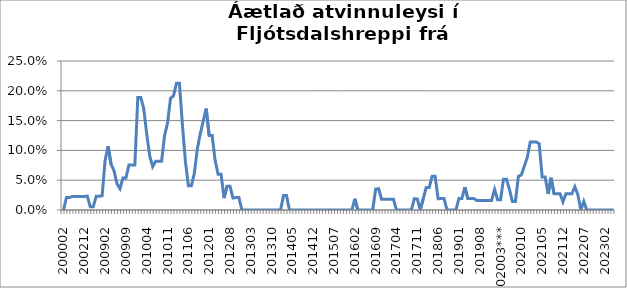
| Category | Series 0 |
|---|---|
| 200002 | 0 |
| 200102 | 0.021 |
| 200103 | 0.021 |
| 200111 | 0.023 |
| 200112 | 0.023 |
| 200201 | 0.023 |
| 200211 | 0.023 |
| 200212 | 0.023 |
| 200302 | 0.023 |
| 200409 | 0.005 |
| 200410 | 0.005 |
| 200811 | 0.023 |
| 200812 | 0.023 |
| 200901 | 0.024 |
| 200902 | 0.083 |
| 200903 | 0.107 |
| 200904 | 0.077 |
| 200905 | 0.066 |
| 200906 | 0.044 |
| 200907 | 0.036 |
| 200908 | 0.054 |
| 200909 | 0.054 |
| 200910 | 0.075 |
| 200911 | 0.075 |
| 200912 | 0.075 |
| 201001 | 0.189 |
| 201002 | 0.189 |
| 201003 | 0.17 |
| 201004 | 0.127 |
| 201005 | 0.091 |
| 201006 | 0.073 |
| 201007 | 0.082 |
| 201008 | 0.082 |
| 201009 | 0.082 |
| 201010 | 0.125 |
| 201011 | 0.146 |
| 201012 | 0.188 |
| 201101 | 0.191 |
| 201102 | 0.213 |
| 201103 | 0.213 |
| 201104 | 0.143 |
| 201105 | 0.082 |
| 201106 | 0.041 |
| 201107 | 0.041 |
| 201108 | 0.061 |
| 201109 | 0.102 |
| 201110 | 0.128 |
| 201111 | 0.149 |
| 201112 | 0.17 |
| 201201 | 0.125 |
| 201202 | 0.125 |
| 201203 | 0.083 |
| 201204 | 0.06 |
| 201205 | 0.06 |
| 201206 | 0.02 |
| 201207 | 0.04 |
| 201208 | 0.04 |
| 201209 | 0.02 |
| 201210 | 0.021 |
| 201211 | 0.021 |
| 201212 | 0 |
| 201301 | 0 |
| 201302 | 0 |
| 201303 | 0 |
| 201304 | 0 |
| 201305 | 0 |
| 201306 | 0 |
| 201307 | 0 |
| 201308 | 0 |
| 201309 | 0 |
| 201310 | 0 |
| 201311 | 0 |
| 201312 | 0 |
| 201401 | 0 |
| 201402 | 0.024 |
| 201403 | 0.024 |
| 201404 | 0 |
| 201405 | 0 |
| 201406 | 0 |
| 201407 | 0 |
| 201408 | 0 |
| 201409 | 0 |
| 201410 | 0 |
| 201411 | 0 |
| 201412 | 0 |
| 201501 | 0 |
| 201502 | 0 |
| 201503 | 0 |
| 201504 | 0 |
| 201505 | 0 |
| 201506 | 0 |
| 201507 | 0 |
| 201508 | 0 |
| 201509 | 0 |
| 201510 | 0 |
| 201511 | 0 |
| 201512 | 0 |
| 201601 | 0 |
| 201602 | 0.019 |
| 201603 | 0 |
| 201604 | 0 |
| 201605 | 0 |
| 201606 | 0 |
| 201607 | 0 |
| 201608 | 0 |
| 201609 | 0.035 |
| 201610 | 0.036 |
| 201611 | 0.018 |
| 201612 | 0.018 |
| 201701 | 0.018 |
| 201702 | 0.018 |
| 201703 | 0.018 |
| 201704 | 0 |
| 201705 | 0 |
| 201706 | 0 |
| 201707 | 0 |
| 201708 | 0 |
| 201709 | 0 |
| 201710 | 0.019 |
| 201711 | 0.019 |
| 201712 | 0 |
| 201801 | 0.019 |
| 201802 | 0.038 |
| 201803 | 0.038 |
| 201804 | 0.057 |
| 201805 | 0.057 |
| 201806 | 0.019 |
| 201807 | 0.019 |
| 201808 | 0.019 |
| 201809 | 0 |
| 201810 | 0 |
| 201811 | 0 |
| 201812 | 0 |
| 201901 | 0.019 |
| 201902 | 0.019 |
| 201903 | 0.038 |
| 201904 | 0.019 |
| 201905 | 0.019 |
| 201906 | 0.019 |
| 201907 | 0.016 |
| 201908 | 0.016 |
| 201909 | 0.016 |
| 201910 | 0.016 |
| 201911 | 0.016 |
| 201912 | 0.016 |
| 202001 | 0.034 |
| 202002 | 0.017 |
| 202003*** | 0.017 |
| 202004 | 0.052 |
| 202005 | 0.052 |
| 202006 | 0.034 |
| 202007 | 0.014 |
| 202008 | 0.014 |
| 202009 | 0.056 |
| 202010 | 0.059 |
| 202011 | 0.074 |
| 202012 | 0.088 |
| 202101 | 0.114 |
| 202102 | 0.114 |
| 202103 | 0.114 |
| 202104 | 0.111 |
| 202105 | 0.056 |
| 202106 | 0.056 |
| 202107 | 0.027 |
| 202108 | 0.054 |
| 202109 | 0.027 |
| 202110 | 0.027 |
| 202111 | 0.027 |
| 202112 | 0.014 |
| 202201 | 0.027 |
| 202202 | 0.027 |
| 202203 | 0.027 |
| 202204 | 0.039 |
| 202205 | 0.026 |
| 202206 | 0 |
| 202207 | 0.014 |
| 202208 | 0 |
| 202209 | 0 |
| 202210 | 0 |
| 202211 | 0 |
| 202212 | 0 |
| 202301 | 0 |
| 202302 | 0 |
| 202303 | 0 |
| 202304 | 0 |
| 202305 | 0 |